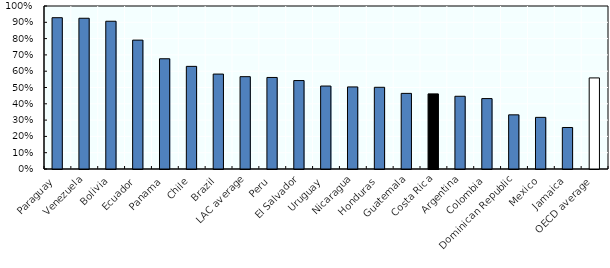
| Category | VRR |
|---|---|
| Paraguay | 0.928 |
| Venezuela | 0.925 |
| Bolivia | 0.906 |
| Ecuador | 0.791 |
| Panama | 0.676 |
| Chile | 0.63 |
| Brazil | 0.582 |
| LAC average | 0.566 |
| Peru | 0.562 |
| El Salvador | 0.543 |
| Uruguay | 0.509 |
| Nicaragua | 0.503 |
| Honduras | 0.501 |
| Guatemala | 0.464 |
| Costa Rica | 0.461 |
| Argentina | 0.446 |
| Colombia | 0.432 |
| Dominican Republic | 0.332 |
| Mexico | 0.317 |
| Jamaica | 0.255 |
| OECD average | 0.559 |